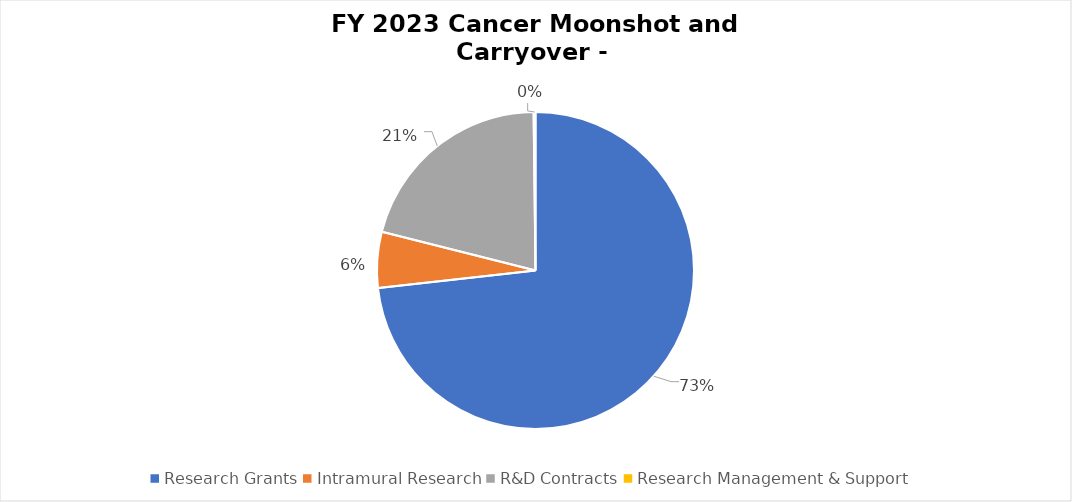
| Category | Series 0 |
|---|---|
| Research Grants | 91101859 |
| Intramural Research | 7086652 |
| R&D Contracts | 25981074 |
| Research Management & Support | 236744 |